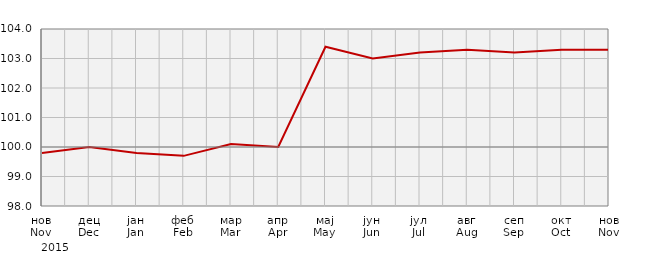
| Category | Индекси цијена произвођача
Producer price indices |
|---|---|
| нов
Nov | 99.8 |
| дец
Dec | 100 |
| јан
Jan | 99.8 |
| феб
Feb | 99.7 |
| мар
Mar | 100.1 |
| апр
Apr | 100 |
| мај
May | 103.4 |
| јун
Jun | 103 |
| јул
Jul | 103.2 |
| авг
Aug | 103.3 |
| сеп
Sep | 103.2 |
| окт
Oct | 103.3 |
| нов
Nov | 103.3 |